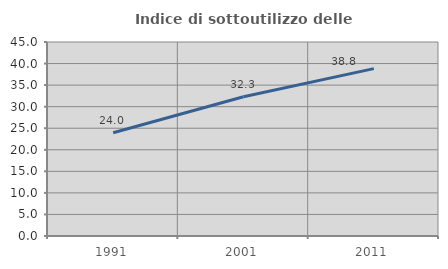
| Category | Indice di sottoutilizzo delle abitazioni  |
|---|---|
| 1991.0 | 23.958 |
| 2001.0 | 32.291 |
| 2011.0 | 38.817 |